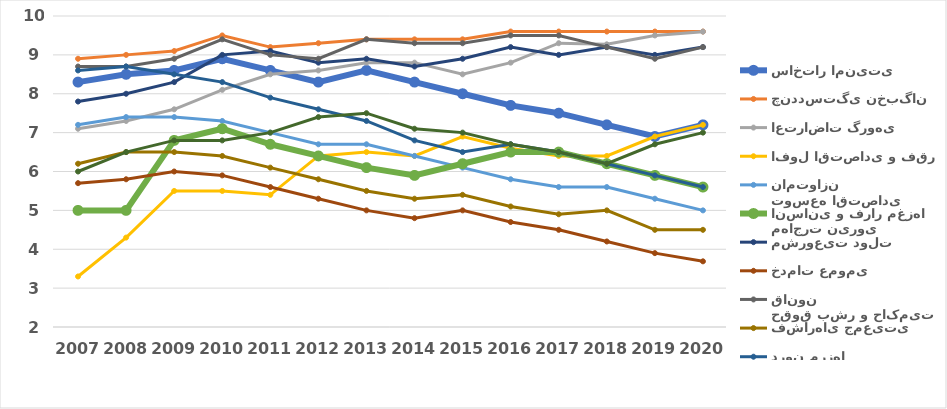
| Category | ساختار امنیتی | چنددستگی نخبگان | اعتراضات گروهی | افول اقتصادی و فقر | توسعه اقتصادی نامتوازن | مهاجرت نیروی انسانی و فرار مغزها | مشروعیت دولت | خدمات عمومی | حقوق بشر و حاکمیت قانون | فشارهای جمعیتی | پناهجویان و آوارگان درون مرزها | مداخلات خارجی |
|---|---|---|---|---|---|---|---|---|---|---|---|---|
| 2007.0 | 8.3 | 8.9 | 7.1 | 3.3 | 7.2 | 5 | 7.8 | 5.7 | 8.7 | 6.2 | 8.6 | 6 |
| 2008.0 | 8.5 | 9 | 7.3 | 4.3 | 7.4 | 5 | 8 | 5.8 | 8.7 | 6.5 | 8.7 | 6.5 |
| 2009.0 | 8.6 | 9.1 | 7.6 | 5.5 | 7.4 | 6.8 | 8.3 | 6 | 8.9 | 6.5 | 8.5 | 6.8 |
| 2010.0 | 8.9 | 9.5 | 8.1 | 5.5 | 7.3 | 7.1 | 9 | 5.9 | 9.4 | 6.4 | 8.3 | 6.8 |
| 2011.0 | 8.6 | 9.2 | 8.5 | 5.4 | 7 | 6.7 | 9.1 | 5.6 | 9 | 6.1 | 7.9 | 7 |
| 2012.0 | 8.3 | 9.3 | 8.6 | 6.4 | 6.7 | 6.4 | 8.8 | 5.3 | 8.9 | 5.8 | 7.6 | 7.4 |
| 2013.0 | 8.6 | 9.4 | 8.8 | 6.5 | 6.7 | 6.1 | 8.9 | 5 | 9.4 | 5.5 | 7.3 | 7.5 |
| 2014.0 | 8.3 | 9.4 | 8.8 | 6.4 | 6.4 | 5.9 | 8.7 | 4.8 | 9.3 | 5.3 | 6.8 | 7.1 |
| 2015.0 | 8 | 9.4 | 8.5 | 6.9 | 6.1 | 6.2 | 8.9 | 5 | 9.3 | 5.4 | 6.5 | 7 |
| 2016.0 | 7.7 | 9.6 | 8.8 | 6.6 | 5.8 | 6.5 | 9.2 | 4.7 | 9.5 | 5.1 | 6.7 | 6.7 |
| 2017.0 | 7.5 | 9.6 | 9.3 | 6.4 | 5.6 | 6.5 | 9 | 4.5 | 9.5 | 4.9 | 6.5 | 6.5 |
| 2018.0 | 7.2 | 9.6 | 9.271 | 6.4 | 5.6 | 6.2 | 9.2 | 4.2 | 9.2 | 5 | 6.2 | 6.2 |
| 2019.0 | 6.9 | 9.6 | 9.5 | 6.9 | 5.3 | 5.9 | 9 | 3.9 | 8.9 | 4.5 | 5.9 | 6.7 |
| 2020.0 | 7.2 | 9.6 | 9.597 | 7.2 | 5 | 5.6 | 9.2 | 3.689 | 9.2 | 4.5 | 5.6 | 7 |